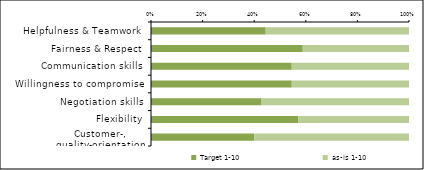
| Category | Target 1-10 | as-is 1-10 |
|---|---|---|
| Helpfulness & Teamwork | 8 | 10 |
| Fairness & Respect | 10 | 7 |
| Communication skills | 6 | 5 |
| Willingness to compromise | 6 | 5 |
| Negotiation skills | 6 | 8 |
| Flexibility | 4 | 3 |
| Customer-, quality-orientation | 6 | 9 |